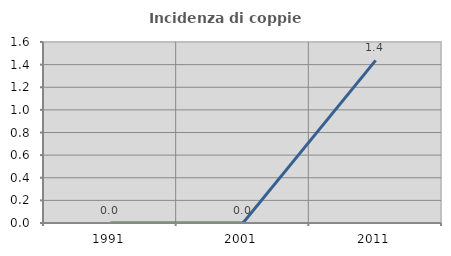
| Category | Incidenza di coppie miste |
|---|---|
| 1991.0 | 0 |
| 2001.0 | 0 |
| 2011.0 | 1.437 |